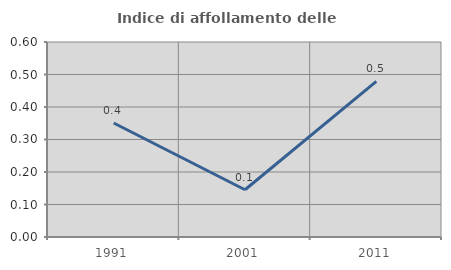
| Category | Indice di affollamento delle abitazioni  |
|---|---|
| 1991.0 | 0.351 |
| 2001.0 | 0.145 |
| 2011.0 | 0.479 |